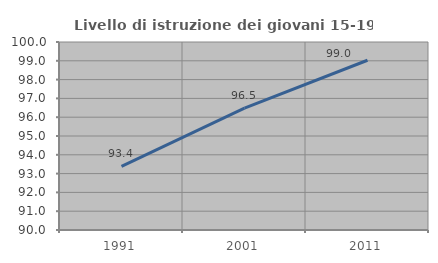
| Category | Livello di istruzione dei giovani 15-19 anni |
|---|---|
| 1991.0 | 93.382 |
| 2001.0 | 96.483 |
| 2011.0 | 99.029 |